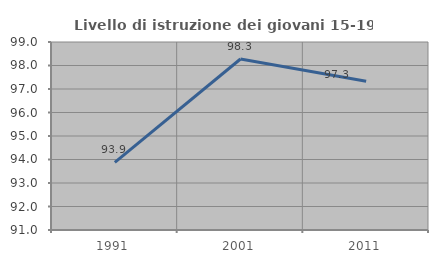
| Category | Livello di istruzione dei giovani 15-19 anni |
|---|---|
| 1991.0 | 93.878 |
| 2001.0 | 98.276 |
| 2011.0 | 97.333 |